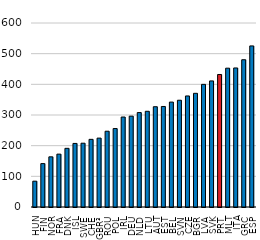
| Category | Series 0 |
|---|---|
| HUN | 84.2 |
| FIN | 141.5 |
| NOR | 163.6 |
| FRA | 172.4 |
| DNK | 191.3 |
| ISL | 207.3 |
| SWE | 208 |
| CHE | 220.6 |
| GBR³ | 224.6 |
| ROU | 247.1 |
| POL | 255.8 |
| IRL | 293.4 |
| DEU | 296.2 |
| NLD | 307.9 |
| LTU | 312.1 |
| AUT | 327 |
| EST | 327.8 |
| BEL | 342.1 |
| SVN | 348.1 |
| CZE | 362.1 |
| BGR | 370.7 |
| LVA | 399.9 |
| SVK | 411.1 |
| PRT | 432.1 |
| MLT | 452.7 |
| ITA | 453.4 |
| GRC | 480.2 |
| ESP | 525.3 |